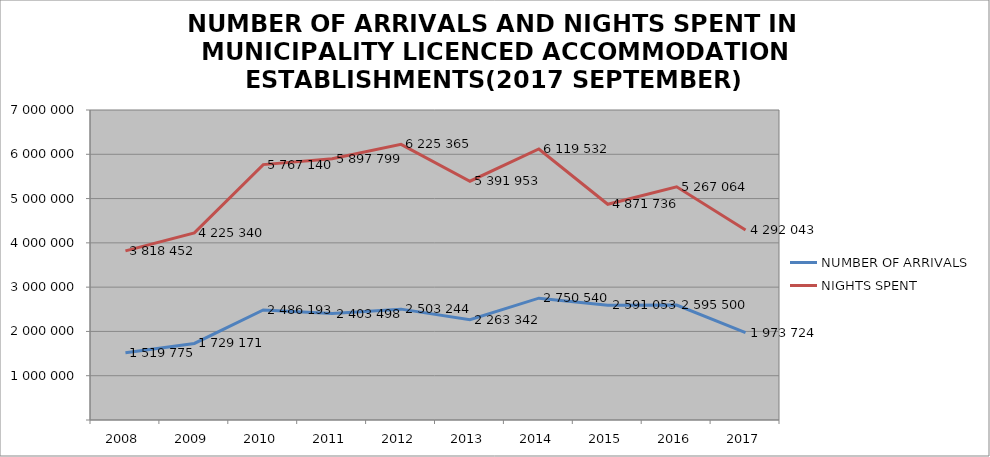
| Category | NUMBER OF ARRIVALS | NIGHTS SPENT |
|---|---|---|
| 2008 | 1519775 | 3818452 |
| 2009 | 1729171 | 4225340 |
| 2010 | 2486193 | 5767140 |
| 2011 | 2403498 | 5897799 |
| 2012 | 2503244 | 6225365 |
| 2013 | 2263342 | 5391953 |
| 2014 | 2750540 | 6119532 |
| 2015 | 2591053 | 4871736 |
| 2016 | 2595500 | 5267064 |
| 2017 | 1973724 | 4292043 |